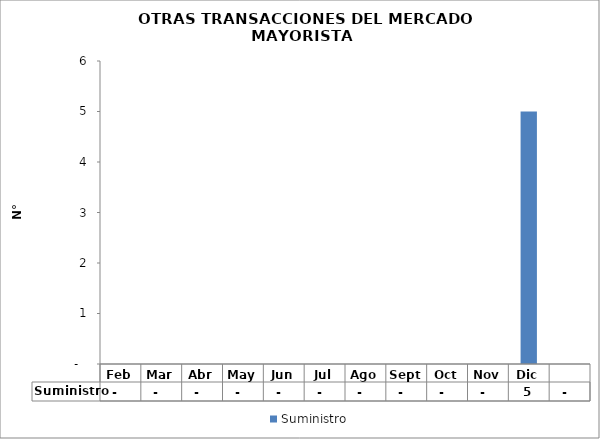
| Category | Suministro |
|---|---|
| Feb | 0 |
| Mar | 0 |
| Abr | 0 |
| May | 0 |
| Jun | 0 |
| Jul | 0 |
| Ago | 0 |
| Sept | 0 |
| Oct | 0 |
| Nov | 0 |
| Dic | 5 |